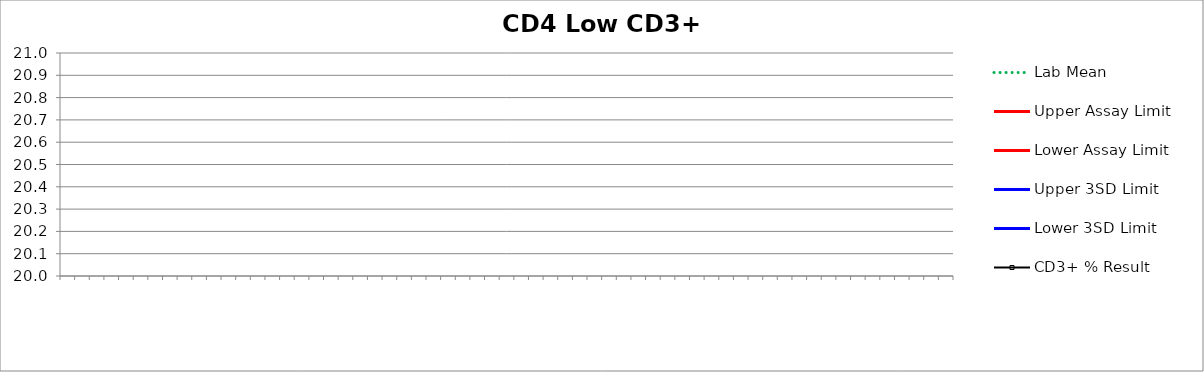
| Category | Lab Mean | Upper Assay Limit | Lower Assay Limit | Upper 3SD Limit | Lower 3SD Limit | CD3+ % Result |
|---|---|---|---|---|---|---|
|  | 0 |  |  | 0 | 0 |  |
|  | 0 |  |  | 0 | 0 |  |
|  | 0 |  |  | 0 | 0 |  |
|  | 0 |  |  | 0 | 0 |  |
|  | 0 |  |  | 0 | 0 |  |
|  | 0 |  |  | 0 | 0 |  |
|  | 0 |  |  | 0 | 0 |  |
|  | 0 |  |  | 0 | 0 |  |
|  | 0 |  |  | 0 | 0 |  |
|  | 0 |  |  | 0 | 0 |  |
|  | 0 |  |  | 0 | 0 |  |
|  | 0 |  |  | 0 | 0 |  |
|  | 0 |  |  | 0 | 0 |  |
|  | 0 |  |  | 0 | 0 |  |
|  | 0 |  |  | 0 | 0 |  |
|  | 0 |  |  | 0 | 0 |  |
|  | 0 |  |  | 0 | 0 |  |
|  | 0 |  |  | 0 | 0 |  |
|  | 0 |  |  | 0 | 0 |  |
|  | 0 |  |  | 0 | 0 |  |
|  | 0 |  |  | 0 | 0 |  |
|  | 0 |  |  | 0 | 0 |  |
|  | 0 |  |  | 0 | 0 |  |
|  | 0 |  |  | 0 | 0 |  |
|  | 0 |  |  | 0 | 0 |  |
|  | 0 |  |  | 0 | 0 |  |
|  | 0 |  |  | 0 | 0 |  |
|  | 0 |  |  | 0 | 0 |  |
|  | 0 |  |  | 0 | 0 |  |
|  | 0 |  |  | 0 | 0 |  |
|  | 0 |  |  | 0 | 0 |  |
|  | 0 |  |  | 0 | 0 |  |
|  | 0 |  |  | 0 | 0 |  |
|  | 0 |  |  | 0 | 0 |  |
|  | 0 |  |  | 0 | 0 |  |
|  | 0 |  |  | 0 | 0 |  |
|  | 0 |  |  | 0 | 0 |  |
|  | 0 |  |  | 0 | 0 |  |
|  | 0 |  |  | 0 | 0 |  |
|  | 0 |  |  | 0 | 0 |  |
|  | 0 |  |  | 0 | 0 |  |
|  | 0 |  |  | 0 | 0 |  |
|  | 0 |  |  | 0 | 0 |  |
|  | 0 |  |  | 0 | 0 |  |
|  | 0 |  |  | 0 | 0 |  |
|  | 0 |  |  | 0 | 0 |  |
|  | 0 |  |  | 0 | 0 |  |
|  | 0 |  |  | 0 | 0 |  |
|  | 0 |  |  | 0 | 0 |  |
|  | 0 |  |  | 0 | 0 |  |
|  | 0 |  |  | 0 | 0 |  |
|  | 0 |  |  | 0 | 0 |  |
|  | 0 |  |  | 0 | 0 |  |
|  | 0 |  |  | 0 | 0 |  |
|  | 0 |  |  | 0 | 0 |  |
|  | 0 |  |  | 0 | 0 |  |
|  | 0 |  |  | 0 | 0 |  |
|  | 0 |  |  | 0 | 0 |  |
|  | 0 |  |  | 0 | 0 |  |
|  | 0 |  |  | 0 | 0 |  |
|  | 0 |  |  | 0 | 0 |  |
|  | 0 |  |  | 0 | 0 |  |